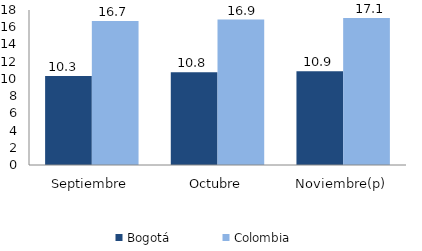
| Category | Bogotá | Colombia |
|---|---|---|
| Septiembre | 10.325 | 16.717 |
| Octubre | 10.767 | 16.896 |
| Noviembre(p) | 10.889 | 17.059 |